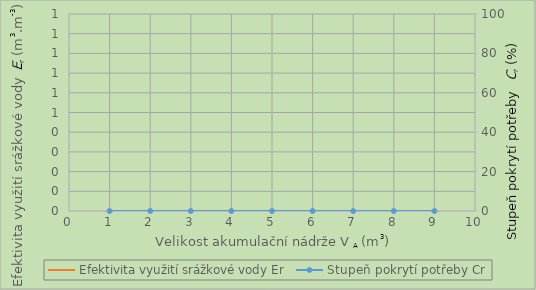
| Category | Efektivita využití srážkové vody Er |
|---|---|
| 0.0 | 0 |
| 0.0 | 0 |
| 0.0 | 0 |
| 0.0 | 0 |
| 0.0 | 0 |
| 0.0 | 0 |
| 0.0 | 0 |
| 0.0 | 0 |
| 0.0 | 0 |